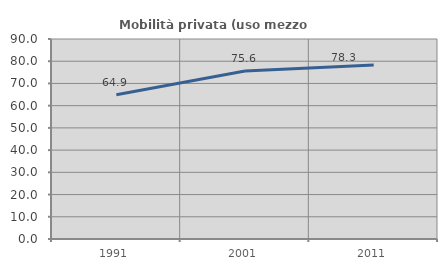
| Category | Mobilità privata (uso mezzo privato) |
|---|---|
| 1991.0 | 64.885 |
| 2001.0 | 75.628 |
| 2011.0 | 78.328 |